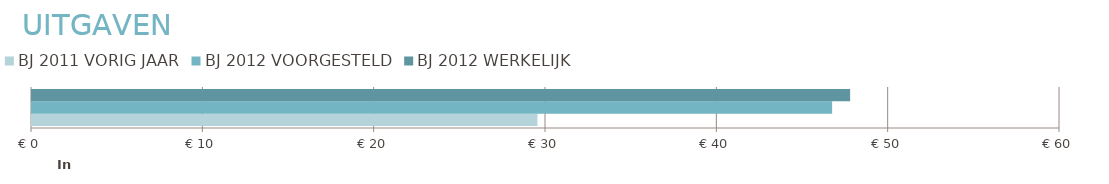
| Category | BJ 2011 | BJ 2012 |
|---|---|---|
| 0 | 29500 | 47750 |